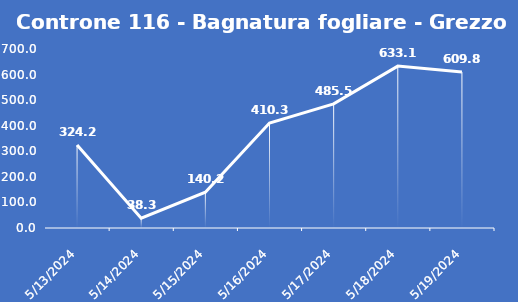
| Category | Controne 116 - Bagnatura fogliare - Grezzo (min) |
|---|---|
| 5/13/24 | 324.2 |
| 5/14/24 | 38.3 |
| 5/15/24 | 140.2 |
| 5/16/24 | 410.3 |
| 5/17/24 | 485.5 |
| 5/18/24 | 633.1 |
| 5/19/24 | 609.8 |